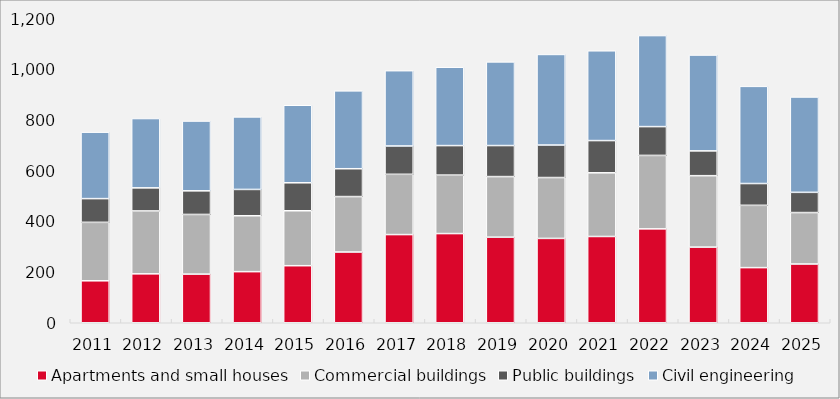
| Category | Apartments and small houses | Commercial buildings | Public buildings | Civil engineering |
|---|---|---|---|---|
| 2011.0 | 165.611 | 230.787 | 93.586 | 262.414 |
| 2012.0 | 193.055 | 248.314 | 91.15 | 273.632 |
| 2013.0 | 192.063 | 235.482 | 93.229 | 275.466 |
| 2014.0 | 201.737 | 220.689 | 103.832 | 286.333 |
| 2015.0 | 225.223 | 216.844 | 110.451 | 306.007 |
| 2016.0 | 279.253 | 218.835 | 109.907 | 307.342 |
| 2017.0 | 348.101 | 237.848 | 111.816 | 297.221 |
| 2018.0 | 351.997 | 230.874 | 116.433 | 309.318 |
| 2019.0 | 337.868 | 239.103 | 122.509 | 330.237 |
| 2020.0 | 332.992 | 240.224 | 128.337 | 357.559 |
| 2021.0 | 340.528 | 251.426 | 127.153 | 354.437 |
| 2022.0 | 370.607 | 289.921 | 113.769 | 359.348 |
| 2023.0 | 298.636 | 281.907 | 97.97 | 378.254 |
| 2024.0 | 217.645 | 245.89 | 86.029 | 383.59 |
| 2025.0 | 231.969 | 203.039 | 79.799 | 376.409 |